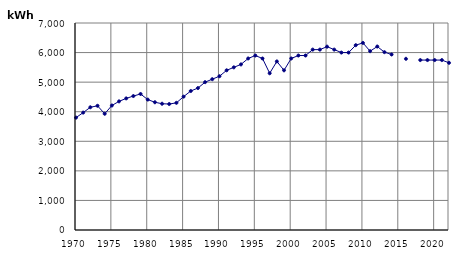
| Category | kWh |
|---|---|
| 1970.0 | 3800 |
| 1971.0 | 3970 |
| 1972.0 | 4150 |
| 1973.0 | 4200 |
| 1974.0 | 3930 |
| 1975.0 | 4210 |
| 1976.0 | 4350 |
| 1977.0 | 4450 |
| 1978.0 | 4530 |
| 1979.0 | 4600 |
| 1980.0 | 4410 |
| 1981.0 | 4320 |
| 1982.0 | 4270 |
| 1983.0 | 4260 |
| 1984.0 | 4300 |
| 1985.0 | 4510 |
| 1986.0 | 4700 |
| 1987.0 | 4800 |
| 1988.0 | 5000 |
| 1989.0 | 5100 |
| 1990.0 | 5200 |
| 1991.0 | 5400 |
| 1992.0 | 5500 |
| 1993.0 | 5600 |
| 1994.0 | 5800 |
| 1995.0 | 5900 |
| 1996.0 | 5800 |
| 1997.0 | 5300 |
| 1998.0 | 5700 |
| 1999.0 | 5400 |
| 2000.0 | 5800 |
| 2001.0 | 5900 |
| 2002.0 | 5900 |
| 2003.0 | 6100 |
| 2004.0 | 6100 |
| 2005.0 | 6200 |
| 2006.0 | 6100 |
| 2007.0 | 6000 |
| 2008.0 | 6000 |
| 2009.0 | 6249.909 |
| 2010.0 | 6326.873 |
| 2011.0 | 6047.482 |
| 2012.0 | 6204.612 |
| 2013.0 | 6014.448 |
| 2014.0 | 5935.345 |
| 2015.0 | 0 |
| 2016.0 | 5789.522 |
| 2017.0 | 0 |
| 2018.0 | 5746.621 |
| 2019.0 | 5746.621 |
| 2020.0 | 5746.621 |
| 2021.0 | 5746.621 |
| 2022.0 | 5654.122 |